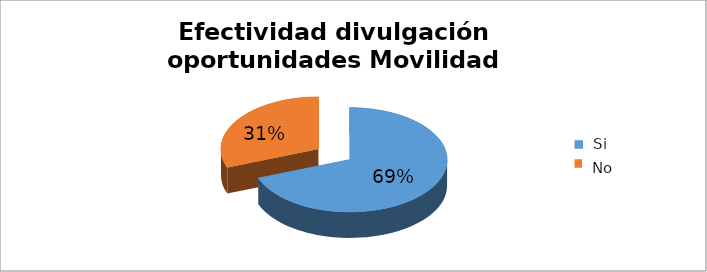
| Category | Porcentaje |
|---|---|
| 0 | 0.692 |
| 1 | 0.308 |